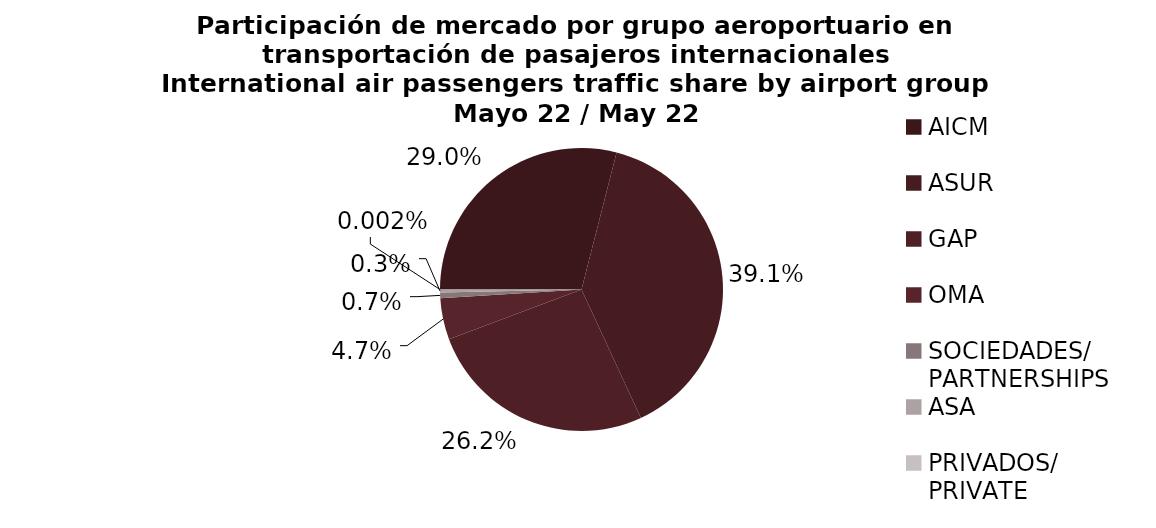
| Category | Series 0 |
|---|---|
| AICM | 1243.148 |
| ASUR | 1677.254 |
| GAP | 1122.907 |
| OMA | 202.387 |
| SOCIEDADES/
PARTNERSHIPS | 28.221 |
| ASA | 14.16 |
| PRIVADOS/
PRIVATE | 0.099 |